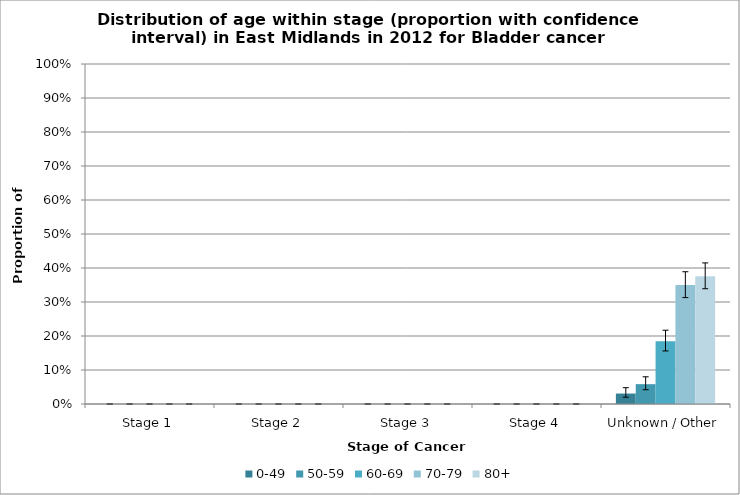
| Category | 0-49 | 50-59 | 60-69 | 70-79 | 80+ |
|---|---|---|---|---|---|
| Stage 1 | 0 | 0 | 0 | 0 | 0 |
| Stage 2 | 0 | 0 | 0 | 0 | 0 |
| Stage 3 | 0 | 0 | 0 | 0 | 0 |
| Stage 4 | 0 | 0 | 0 | 0 | 0 |
| Unknown / Other | 0.031 | 0.058 | 0.185 | 0.35 | 0.376 |